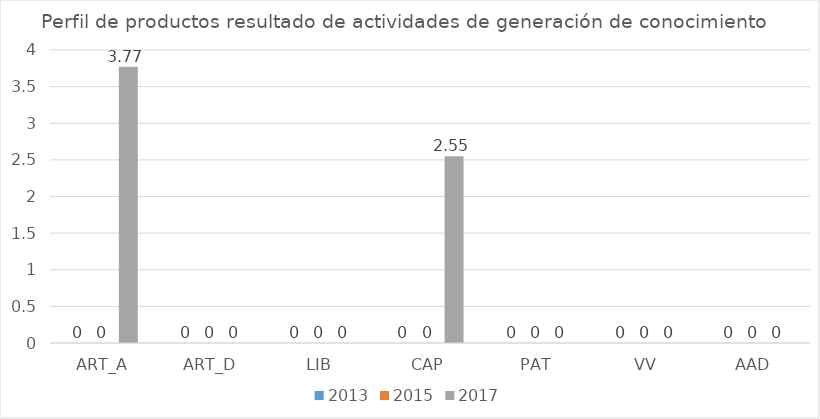
| Category | 2013 | 2015 | 2017 |
|---|---|---|---|
| ART_A | 0 | 0 | 3.77 |
| ART_D | 0 | 0 | 0 |
| LIB | 0 | 0 | 0 |
| CAP | 0 | 0 | 2.55 |
| PAT | 0 | 0 | 0 |
| VV | 0 | 0 | 0 |
| AAD | 0 | 0 | 0 |